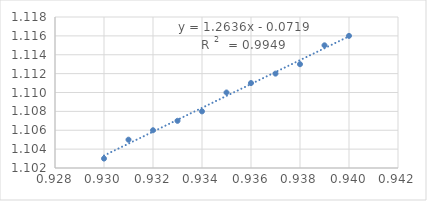
| Category | Series 0 |
|---|---|
| 0.93 | 1.103 |
| 0.931 | 1.105 |
| 0.932 | 1.106 |
| 0.933 | 1.107 |
| 0.934 | 1.108 |
| 0.935 | 1.11 |
| 0.936 | 1.111 |
| 0.937 | 1.112 |
| 0.938 | 1.113 |
| 0.939 | 1.115 |
| 0.94 | 1.116 |